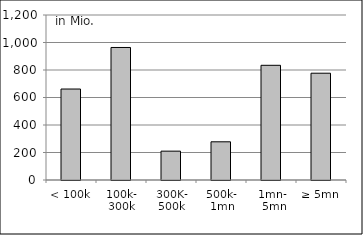
| Category | Series 0 |
|---|---|
| < 100k | 661592229.32 |
| 100k-
300k | 963823545.07 |
| 300K-
500k | 209876774.29 |
| 500k-
1mn | 277796870.66 |
| 1mn-
 5mn | 834129640.61 |
| ≥ 5mn | 776665829.89 |